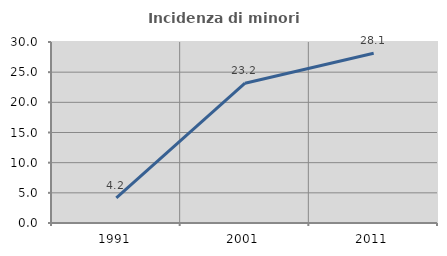
| Category | Incidenza di minori stranieri |
|---|---|
| 1991.0 | 4.167 |
| 2001.0 | 23.171 |
| 2011.0 | 28.125 |